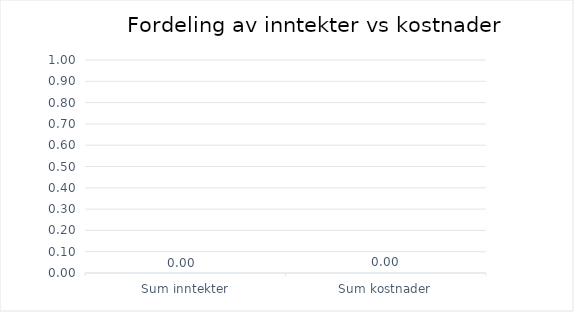
| Category | Series 0 |
|---|---|
| Sum inntekter | 0 |
| Sum kostnader | 0 |